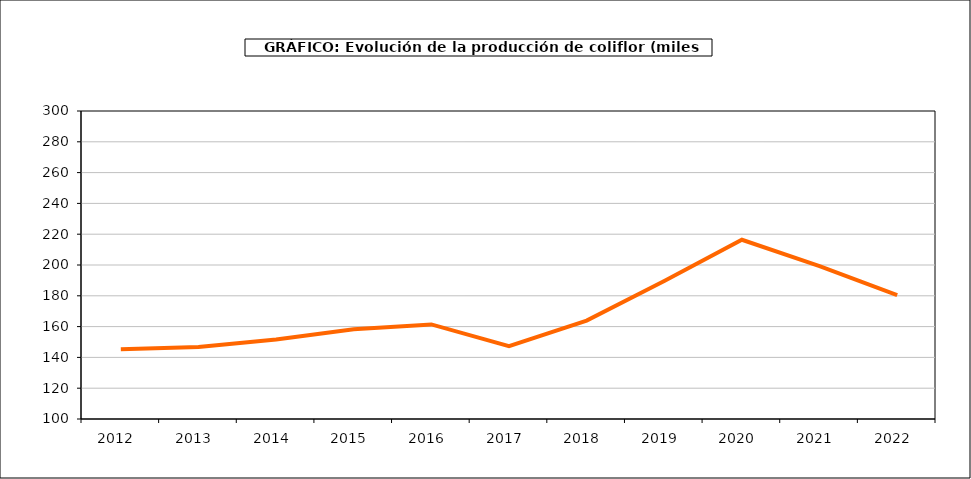
| Category | producción |
|---|---|
| 2012.0 | 145.268 |
| 2013.0 | 146.724 |
| 2014.0 | 151.651 |
| 2015.0 | 158.34 |
| 2016.0 | 161.424 |
| 2017.0 | 147.33 |
| 2018.0 | 163.868 |
| 2019.0 | 189.638 |
| 2020.0 | 216.389 |
| 2021.0 | 199.331 |
| 2022.0 | 180.457 |